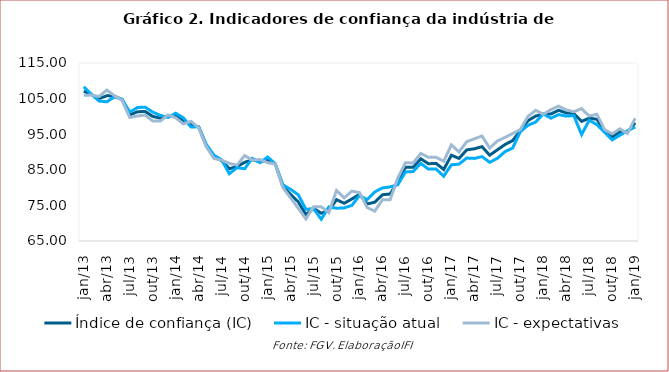
| Category | Índice de confiança (IC) | IC - situação atual | IC - expectativas |
|---|---|---|---|
| jan/13 | 107.1 | 108.3 | 105.9 |
| fev/13 | 106.1 | 106.2 | 106 |
| mar/13 | 105 | 104.3 | 105.6 |
| abr/13 | 105.8 | 104.1 | 107.4 |
| mai/13 | 105.7 | 105.5 | 105.8 |
| jun/13 | 104.7 | 104.8 | 104.5 |
| jul/13 | 100.4 | 101.2 | 99.7 |
| ago/13 | 101.3 | 102.5 | 100.1 |
| set/13 | 101.4 | 102.6 | 100.4 |
| out/13 | 100 | 101.2 | 98.7 |
| nov/13 | 99.5 | 100.3 | 98.7 |
| dez/13 | 100.1 | 99.7 | 100.4 |
| jan/14 | 100.2 | 100.9 | 99.6 |
| fev/14 | 98.8 | 99.6 | 97.9 |
| mar/14 | 97.8 | 97 | 98.6 |
| abr/14 | 97 | 97.1 | 96.8 |
| mai/14 | 91.7 | 92.1 | 91.5 |
| jun/14 | 88.5 | 89.1 | 88.2 |
| jul/14 | 87.6 | 87.8 | 87.7 |
| ago/14 | 85.3 | 83.9 | 86.8 |
| set/14 | 85.9 | 85.6 | 86.3 |
| out/14 | 87.1 | 85.3 | 89 |
| nov/14 | 87.8 | 88.2 | 87.7 |
| dez/14 | 87.3 | 87 | 87.9 |
| jan/15 | 87.6 | 88.6 | 87 |
| fev/15 | 86.6 | 86.7 | 86.6 |
| mar/15 | 80.3 | 80.8 | 80 |
| abr/15 | 78.1 | 79.5 | 77.1 |
| mai/15 | 76 | 78 | 74.2 |
| jun/15 | 72.4 | 73.9 | 71.2 |
| jul/15 | 74.2 | 74.1 | 74.6 |
| ago/15 | 72.8 | 71.1 | 74.6 |
| set/15 | 73.6 | 74.6 | 73 |
| out/15 | 76.6 | 74.2 | 79.2 |
| nov/15 | 75.6 | 74.3 | 77.1 |
| dez/15 | 76.8 | 75 | 79 |
| jan/16 | 78.1 | 77.8 | 78.6 |
| fev/16 | 75.4 | 76.6 | 74.4 |
| mar/16 | 75.9 | 78.8 | 73.4 |
| abr/16 | 78 | 79.9 | 76.6 |
| mai/16 | 78.2 | 80.2 | 76.6 |
| jun/16 | 81.6 | 80.8 | 82.7 |
| jul/16 | 85.7 | 84.4 | 87 |
| ago/16 | 85.7 | 84.5 | 86.9 |
| set/16 | 88.1 | 86.8 | 89.6 |
| out/16 | 86.7 | 85.2 | 88.5 |
| nov/16 | 86.8 | 85.2 | 88.5 |
| dez/16 | 85.1 | 83.2 | 87.4 |
| jan/17 | 89.1 | 86.4 | 92 |
| fev/17 | 88.2 | 86.6 | 90 |
| mar/17 | 90.6 | 88.3 | 92.9 |
| abr/17 | 90.9 | 88.2 | 93.7 |
| mai/17 | 91.5 | 88.7 | 94.5 |
| jun/17 | 89.1 | 87.1 | 91.1 |
| jul/17 | 90.6 | 88.2 | 93.1 |
| ago/17 | 92.1 | 90.1 | 94.1 |
| set/17 | 93.2 | 91.1 | 95.2 |
| out/17 | 96 | 95.7 | 96.3 |
| nov/17 | 98.8 | 97.5 | 100 |
| dez/17 | 100.1 | 98.4 | 101.7 |
| jan/18 | 100.6 | 100.7 | 100.6 |
| fev/18 | 100.7 | 99.5 | 101.9 |
| mar/18 | 101.7 | 100.5 | 102.9 |
| abr/18 | 101 | 100.1 | 101.8 |
| mai/18 | 100.8 | 100.2 | 101.3 |
| jun/18 | 98.6 | 94.9 | 102.2 |
| jul/18 | 99.5 | 98.9 | 100.1 |
| ago/18 | 99.2 | 97.7 | 100.6 |
| set/18 | 95.9 | 95.5 | 96.3 |
| out/18 | 94.2 | 93.4 | 95.1 |
| nov/18 | 95.7 | 94.7 | 96.5 |
| dez/18 | 95.6 | 96 | 95.2 |
| jan/19 | 98.2 | 97 | 99.5 |